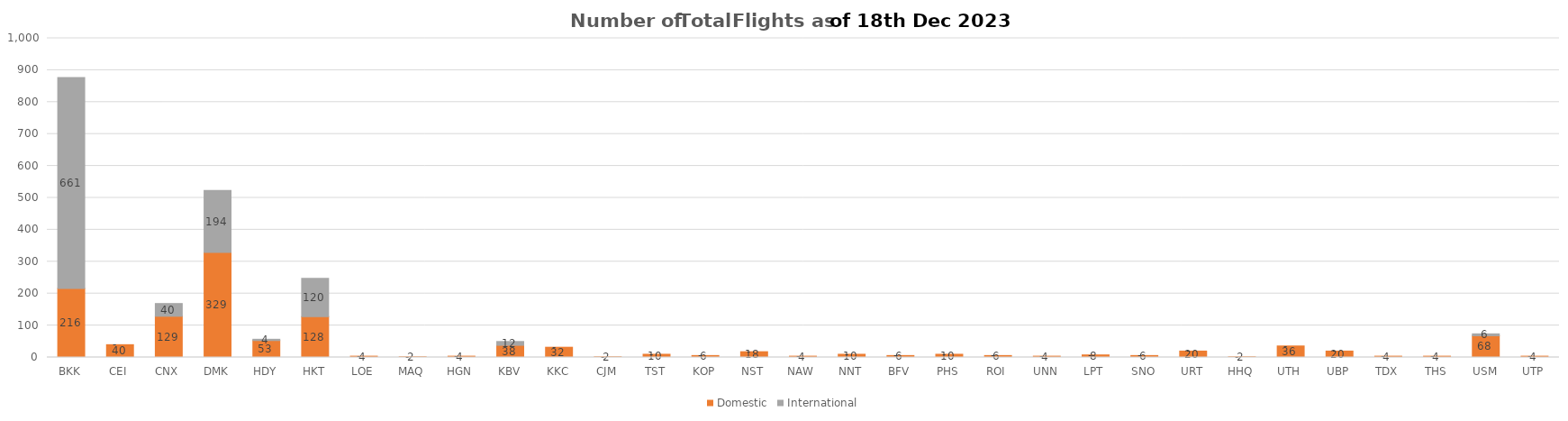
| Category | Domestic | International |
|---|---|---|
| BKK | 216 | 661 |
| CEI | 40 | 0 |
| CNX | 129 | 40 |
| DMK | 329 | 194 |
| HDY | 53 | 4 |
| HKT | 128 | 120 |
| LOE | 4 | 0 |
| MAQ | 2 | 0 |
| HGN | 4 | 0 |
| KBV | 38 | 12 |
| KKC | 32 | 0 |
| CJM | 2 | 0 |
| TST | 10 | 0 |
| KOP | 6 | 0 |
| NST | 18 | 0 |
| NAW | 4 | 0 |
| NNT | 10 | 0 |
| BFV | 6 | 0 |
| PHS | 10 | 0 |
| ROI | 6 | 0 |
| UNN | 4 | 0 |
| LPT | 8 | 0 |
| SNO | 6 | 0 |
| URT | 20 | 0 |
| HHQ | 2 | 0 |
| UTH | 36 | 0 |
| UBP | 20 | 0 |
| TDX | 4 | 0 |
| THS | 4 | 0 |
| USM | 68 | 6 |
| UTP | 4 | 0 |